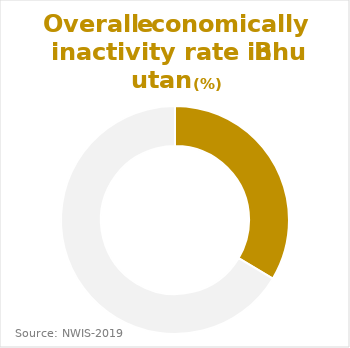
| Category | Bhutan |
|---|---|
| All ages | 33.6 |